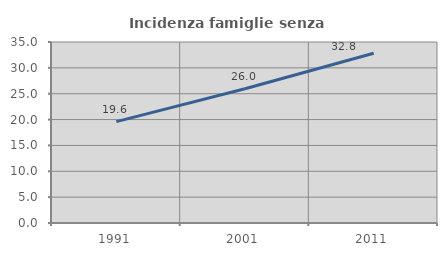
| Category | Incidenza famiglie senza nuclei |
|---|---|
| 1991.0 | 19.604 |
| 2001.0 | 25.958 |
| 2011.0 | 32.831 |